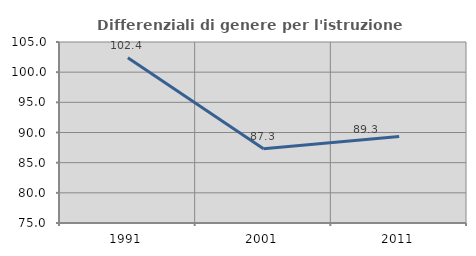
| Category | Differenziali di genere per l'istruzione superiore |
|---|---|
| 1991.0 | 102.373 |
| 2001.0 | 87.298 |
| 2011.0 | 89.343 |